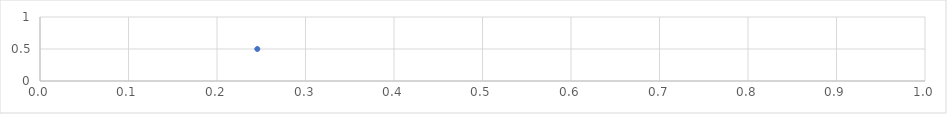
| Category | Series 0 |
|---|---|
| 0.24555484558170404 | 0.5 |